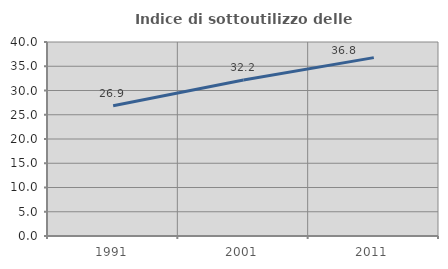
| Category | Indice di sottoutilizzo delle abitazioni  |
|---|---|
| 1991.0 | 26.869 |
| 2001.0 | 32.184 |
| 2011.0 | 36.779 |